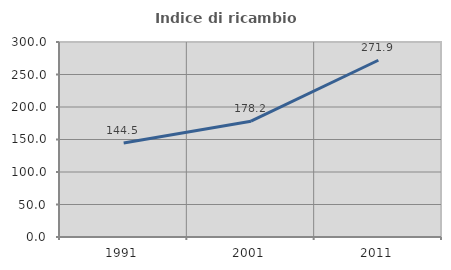
| Category | Indice di ricambio occupazionale  |
|---|---|
| 1991.0 | 144.526 |
| 2001.0 | 178.151 |
| 2011.0 | 271.901 |